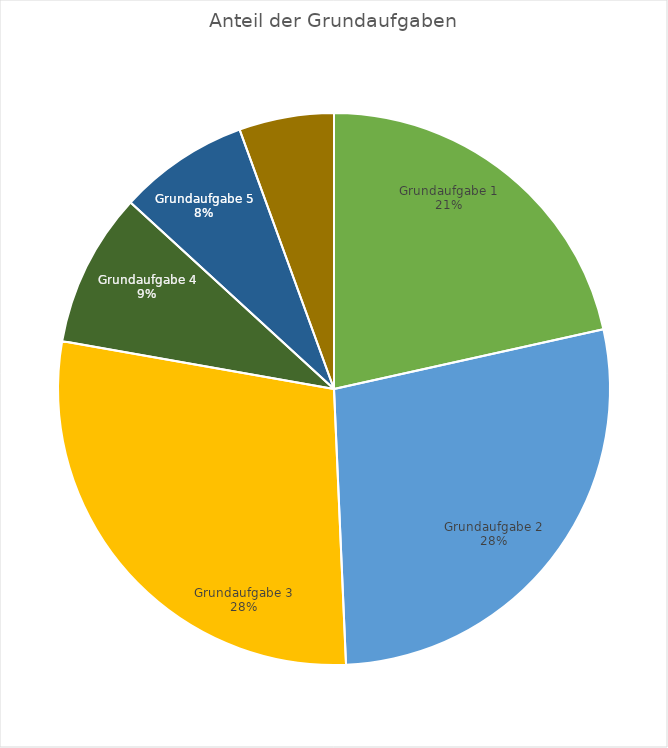
| Category | Grundaufgaben |
|---|---|
| Grundaufgabe 1 | 31 |
| Grundaufgabe 2 | 40 |
| Grundaufgabe 3 | 41 |
| Grundaufgabe 4 | 13 |
| Grundaufgabe 5 | 11 |
| Grundaufgabe 6 | 8 |